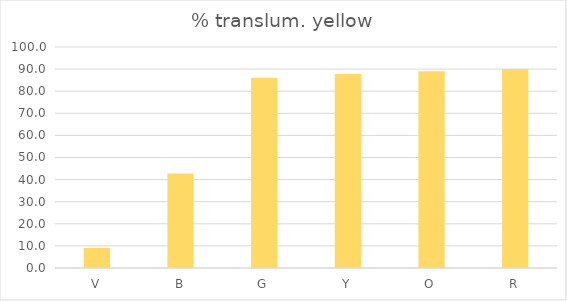
| Category | % translum. yellow |
|---|---|
| V | 9.071 |
| B | 42.748 |
| G | 86.038 |
| Y | 87.732 |
| O | 89.044 |
| R | 90.084 |